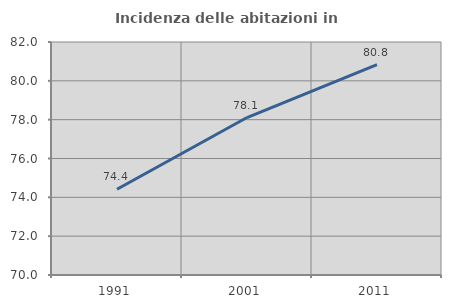
| Category | Incidenza delle abitazioni in proprietà  |
|---|---|
| 1991.0 | 74.414 |
| 2001.0 | 78.109 |
| 2011.0 | 80.837 |